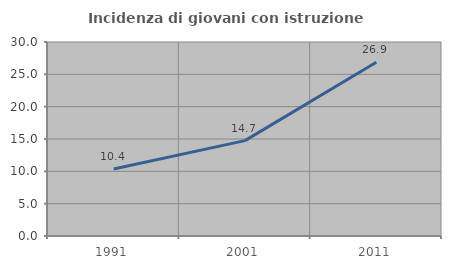
| Category | Incidenza di giovani con istruzione universitaria |
|---|---|
| 1991.0 | 10.372 |
| 2001.0 | 14.747 |
| 2011.0 | 26.866 |